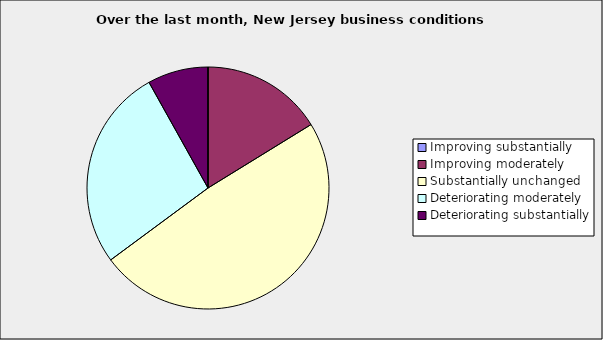
| Category | Series 0 |
|---|---|
| Improving substantially | 0 |
| Improving moderately | 0.162 |
| Substantially unchanged | 0.486 |
| Deteriorating moderately | 0.27 |
| Deteriorating substantially | 0.081 |